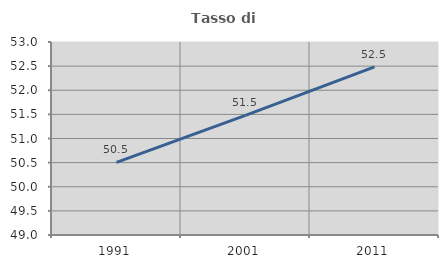
| Category | Tasso di occupazione   |
|---|---|
| 1991.0 | 50.504 |
| 2001.0 | 51.479 |
| 2011.0 | 52.486 |